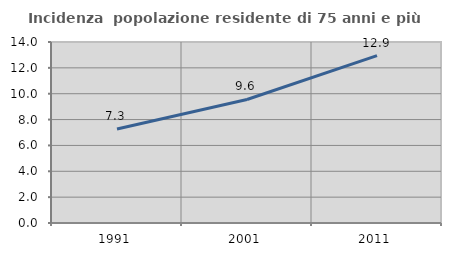
| Category | Incidenza  popolazione residente di 75 anni e più |
|---|---|
| 1991.0 | 7.272 |
| 2001.0 | 9.554 |
| 2011.0 | 12.948 |